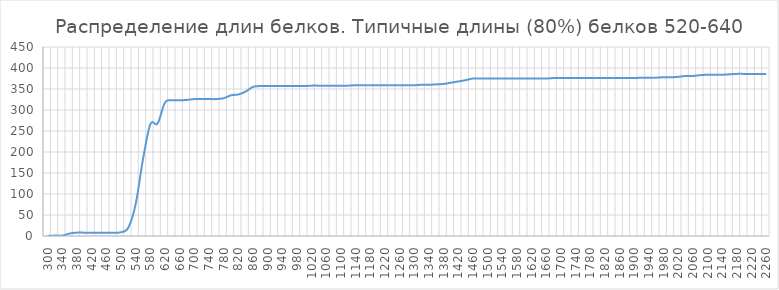
| Category | Series 0 |
|---|---|
| 300.0 | 0 |
| 320.0 | 1 |
| 340.0 | 1 |
| 360.0 | 6 |
| 380.0 | 8 |
| 400.0 | 8 |
| 420.0 | 8 |
| 440.0 | 8 |
| 460.0 | 8 |
| 480.0 | 8 |
| 500.0 | 9 |
| 520.0 | 20 |
| 540.0 | 76 |
| 560.0 | 183 |
| 580.0 | 266 |
| 600.0 | 268 |
| 620.0 | 318 |
| 640.0 | 323 |
| 660.0 | 323 |
| 680.0 | 324 |
| 700.0 | 326 |
| 720.0 | 326 |
| 740.0 | 326 |
| 760.0 | 326 |
| 780.0 | 328 |
| 800.0 | 335 |
| 820.0 | 337 |
| 840.0 | 344 |
| 860.0 | 355 |
| 880.0 | 357 |
| 900.0 | 357 |
| 920.0 | 357 |
| 940.0 | 357 |
| 960.0 | 357 |
| 980.0 | 357 |
| 1000.0 | 357 |
| 1020.0 | 358 |
| 1040.0 | 358 |
| 1060.0 | 358 |
| 1080.0 | 358 |
| 1100.0 | 358 |
| 1120.0 | 358 |
| 1140.0 | 359 |
| 1160.0 | 359 |
| 1180.0 | 359 |
| 1200.0 | 359 |
| 1220.0 | 359 |
| 1240.0 | 359 |
| 1260.0 | 359 |
| 1280.0 | 359 |
| 1300.0 | 359 |
| 1320.0 | 360 |
| 1340.0 | 360 |
| 1360.0 | 361 |
| 1380.0 | 362 |
| 1400.0 | 365 |
| 1420.0 | 368 |
| 1440.0 | 371 |
| 1460.0 | 375 |
| 1480.0 | 375 |
| 1500.0 | 375 |
| 1520.0 | 375 |
| 1540.0 | 375 |
| 1560.0 | 375 |
| 1580.0 | 375 |
| 1600.0 | 375 |
| 1620.0 | 375 |
| 1640.0 | 375 |
| 1660.0 | 375 |
| 1680.0 | 376 |
| 1700.0 | 376 |
| 1720.0 | 376 |
| 1740.0 | 376 |
| 1760.0 | 376 |
| 1780.0 | 376 |
| 1800.0 | 376 |
| 1820.0 | 376 |
| 1840.0 | 376 |
| 1860.0 | 376 |
| 1880.0 | 376 |
| 1900.0 | 376 |
| 1920.0 | 377 |
| 1940.0 | 377 |
| 1960.0 | 377 |
| 1980.0 | 378 |
| 2000.0 | 378 |
| 2020.0 | 379 |
| 2040.0 | 381 |
| 2060.0 | 381 |
| 2080.0 | 383 |
| 2100.0 | 384 |
| 2120.0 | 384 |
| 2140.0 | 384 |
| 2160.0 | 385 |
| 2180.0 | 386 |
| 2200.0 | 386 |
| 2220.0 | 386 |
| 2240.0 | 386 |
| 2260.0 | 386 |